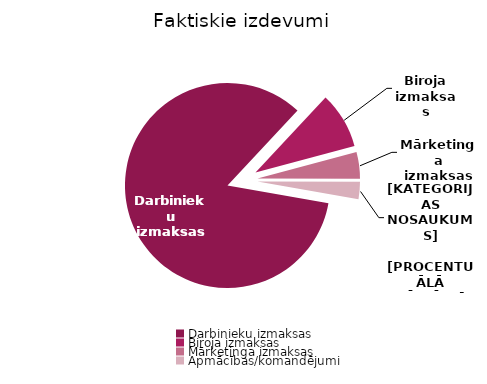
| Category | Series 0 |
|---|---|
| Darbinieku izmaksas | 659130 |
| Biroja izmaksas | 69350 |
| Mārketinga izmaksas | 33159 |
| Apmācības/komandējumi | 21300 |